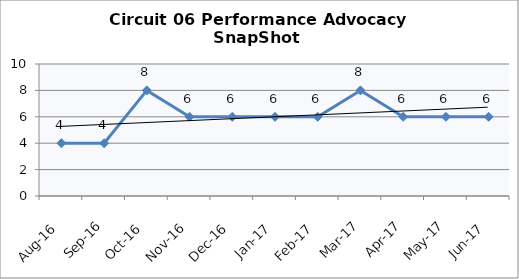
| Category | Circuit 06 |
|---|---|
| Aug-16 | 4 |
| Sep-16 | 4 |
| Oct-16 | 8 |
| Nov-16 | 6 |
| Dec-16 | 6 |
| Jan-17 | 6 |
| Feb-17 | 6 |
| Mar-17 | 8 |
| Apr-17 | 6 |
| May-17 | 6 |
| Jun-17 | 6 |